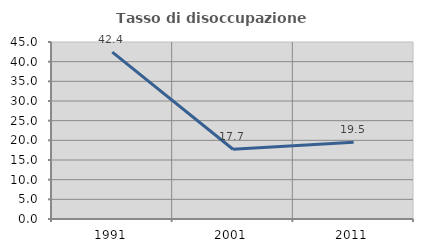
| Category | Tasso di disoccupazione giovanile  |
|---|---|
| 1991.0 | 42.446 |
| 2001.0 | 17.742 |
| 2011.0 | 19.54 |